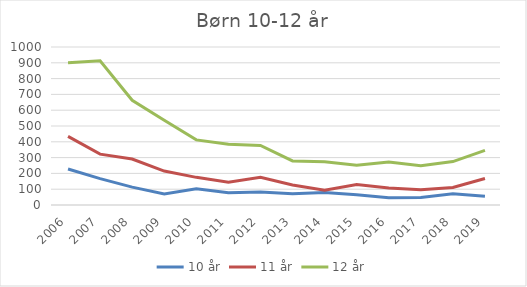
| Category | 10 år | 11 år | 12 år |
|---|---|---|---|
| 2006.0 | 228 | 434 | 901 |
| 2007.0 | 167 | 322 | 913 |
| 2008.0 | 113 | 291 | 663 |
| 2009.0 | 70 | 215 | 536 |
| 2010.0 | 102 | 175 | 412 |
| 2011.0 | 78 | 144 | 385 |
| 2012.0 | 83 | 175 | 377 |
| 2013.0 | 71 | 127 | 279 |
| 2014.0 | 79 | 93 | 274 |
| 2015.0 | 65 | 130 | 251 |
| 2016.0 | 46 | 108 | 272 |
| 2017.0 | 48 | 96 | 249 |
| 2018.0 | 71 | 111 | 275 |
| 2019.0 | 55 | 168 | 346 |